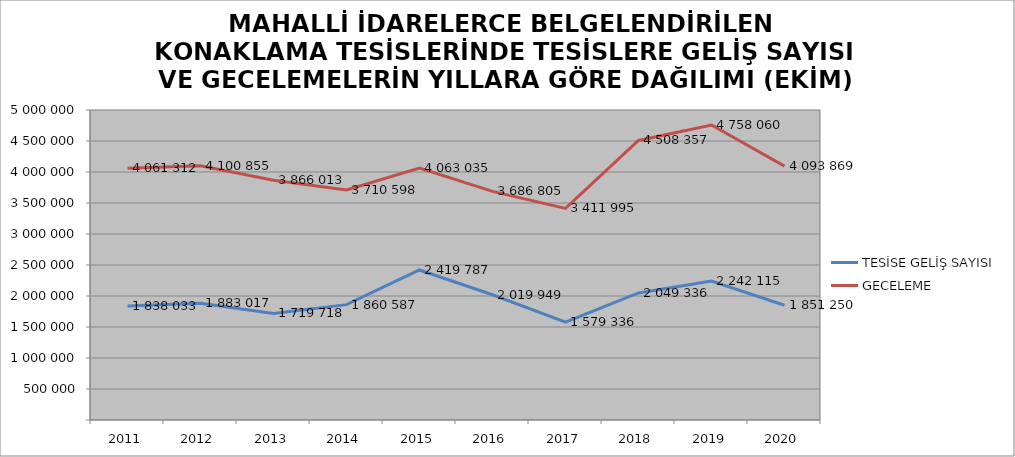
| Category | TESİSE GELİŞ SAYISI | GECELEME |
|---|---|---|
| 2011 | 1838033 | 4061312 |
| 2012 | 1883017 | 4100855 |
| 2013 | 1719718 | 3866013 |
| 2014 | 1860587 | 3710598 |
| 2015 | 2419787 | 4063035 |
| 2016 | 2019949 | 3686805 |
| 2017 | 1579336 | 3411995 |
| 2018 | 2049336 | 4508357 |
| 2019 | 2242115 | 4758060 |
| 2020 | 1851250 | 4093869 |